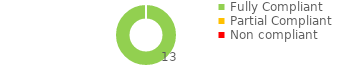
| Category | Series 0 |
|---|---|
| Fully Compliant | 13 |
| Partial Compliant | 0 |
| Non compliant | 0 |